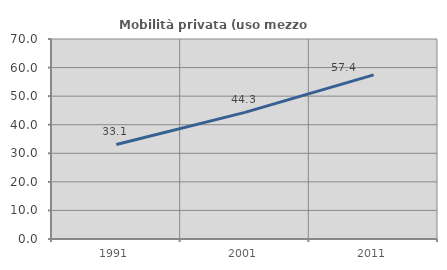
| Category | Mobilità privata (uso mezzo privato) |
|---|---|
| 1991.0 | 33.087 |
| 2001.0 | 44.317 |
| 2011.0 | 57.43 |